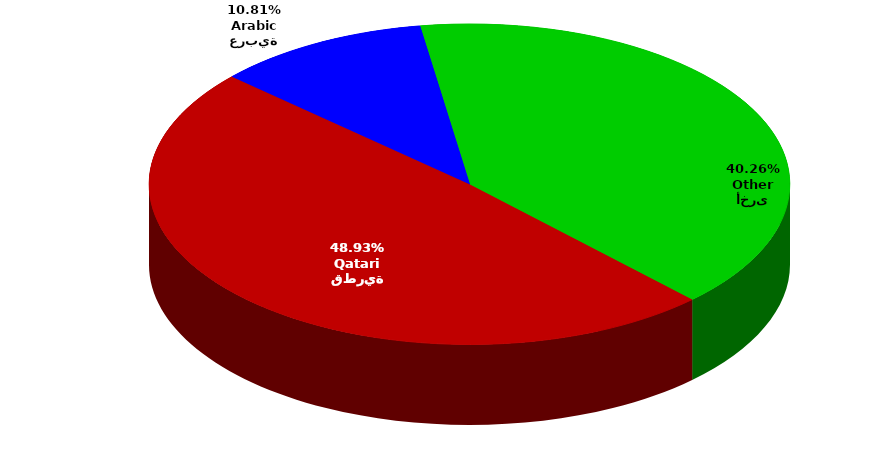
| Category | Series 0 |
|---|---|
| قطرية
Qatari | 482249 |
| عربية
Arabic | 106519 |
| أخرى
Other | 396744 |